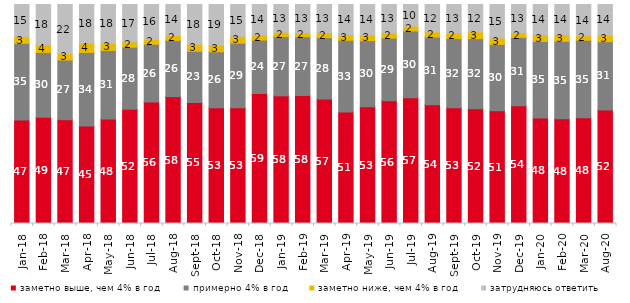
| Category | заметно выше, чем 4% в год | примерно 4% в год | заметно ниже, чем 4% в год | затрудняюсь ответить |
|---|---|---|---|---|
| 2018-01-01 | 47.25 | 35 | 3 | 14.75 |
| 2018-02-01 | 48.5 | 29.6 | 3.5 | 18.4 |
| 2018-03-01 | 47.4 | 27.25 | 2.9 | 22.45 |
| 2018-04-01 | 44.55 | 33.55 | 4.3 | 17.6 |
| 2018-05-01 | 47.7 | 31.3 | 3.25 | 17.75 |
| 2018-06-01 | 52.2 | 28.3 | 2.4 | 17.1 |
| 2018-07-01 | 55.5 | 26.35 | 2.25 | 15.9 |
| 2018-08-01 | 57.95 | 25.65 | 2.3 | 14.1 |
| 2018-09-01 | 55.3 | 23.35 | 3.25 | 18.1 |
| 2018-10-01 | 52.85 | 25.55 | 2.95 | 18.65 |
| 2018-11-01 | 52.844 | 29.491 | 3.144 | 14.521 |
| 2018-12-01 | 59.4 | 24.35 | 2.35 | 13.9 |
| 2019-01-01 | 58.3 | 27.05 | 2 | 12.65 |
| 2019-02-01 | 58.45 | 26.8 | 1.85 | 12.9 |
| 2019-03-01 | 56.887 | 27.946 | 2.387 | 12.78 |
| 2019-04-01 | 50.891 | 32.772 | 2.574 | 13.762 |
| 2019-05-01 | 53.343 | 30.163 | 2.526 | 13.967 |
| 2019-06-01 | 56.06 | 28.579 | 2.444 | 12.918 |
| 2019-07-01 | 57.475 | 30.396 | 2.228 | 9.901 |
| 2019-08-01 | 54.246 | 30.869 | 2.398 | 12.488 |
| 2019-09-01 | 52.822 | 31.634 | 2.475 | 13.069 |
| 2019-10-01 | 52.426 | 31.98 | 3.119 | 12.475 |
| 2019-11-01 | 51.485 | 30.297 | 2.921 | 15.297 |
| 2019-12-01 | 53.713 | 31.238 | 2.079 | 12.97 |
| 2020-01-01 | 48.119 | 35 | 3.02 | 13.861 |
| 2020-02-01 | 47.822 | 35.347 | 2.97 | 13.861 |
| 2020-03-01 | 48.24 | 35.449 | 2.033 | 14.279 |
| 2020-08-01 | 51.787 | 31.231 | 2.88 | 14.101 |